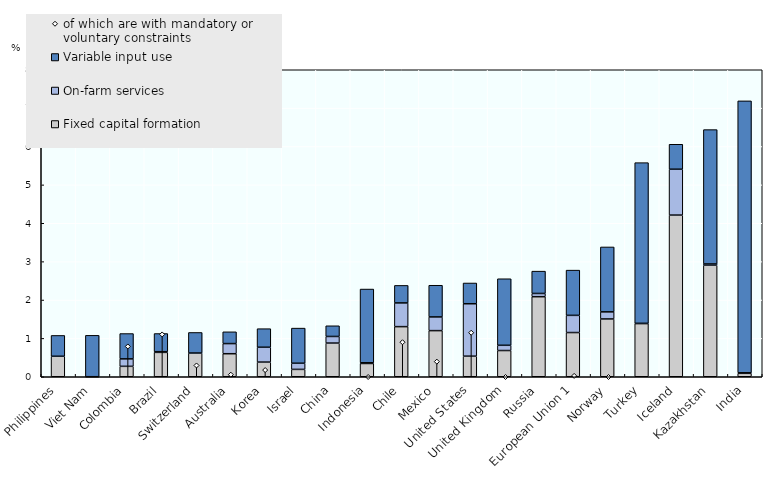
| Category | Fixed capital formation | On-farm services | Variable input use |
|---|---|---|---|
| Philippines | 0.534 | 0 | 0.543 |
| Viet Nam | 0.001 | 0 | 1.079 |
| Colombia | 0.272 | 0.194 | 0.66 |
| Brazil | 0.635 | 0.018 | 0.473 |
| Switzerland | 0.618 | 0 | 0.536 |
| Australia | 0.601 | 0.264 | 0.307 |
| Korea | 0.382 | 0.387 | 0.483 |
| Israel | 0.192 | 0.16 | 0.915 |
| China | 0.877 | 0.172 | 0.279 |
| Indonesia | 0.346 | 0.018 | 1.922 |
| Chile | 1.306 | 0.618 | 0.456 |
| Mexico | 1.202 | 0.357 | 0.826 |
| United States | 0.536 | 1.366 | 0.541 |
| United Kingdom | 0.683 | 0.137 | 1.734 |
| Russia | 2.086 | 0.084 | 0.582 |
| European Union 1 | 1.152 | 0.448 | 1.179 |
| Norway | 1.506 | 0.185 | 1.691 |
| Turkey | 1.386 | 0.006 | 4.188 |
| Iceland | 4.213 | 1.196 | 0.65 |
| Kazakhstan | 2.906 | 0.032 | 3.502 |
| India | 0.089 | 0.014 | 7.087 |